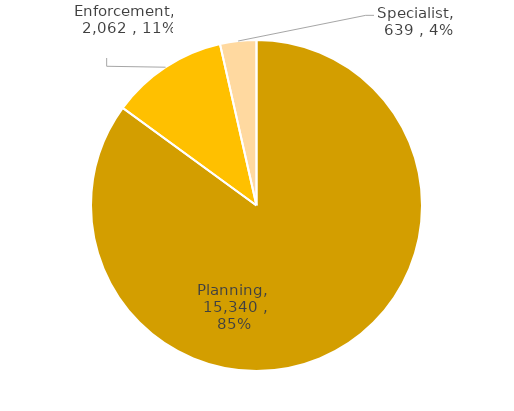
| Category | Series 0 |
|---|---|
| Planning | 15340 |
| Enforcement | 2062 |
| Specialist | 639 |